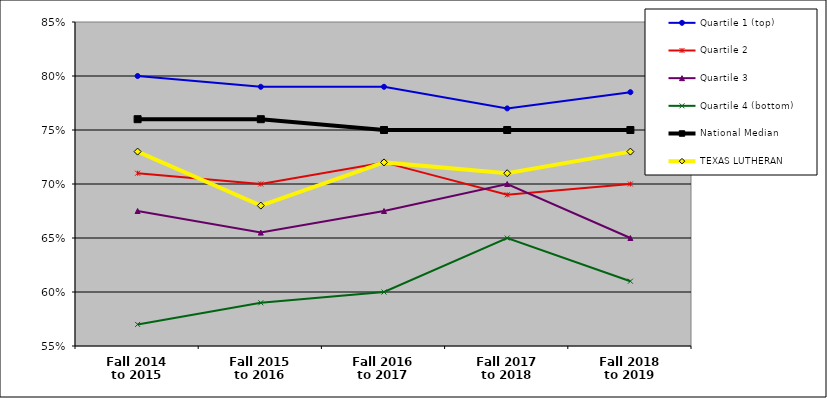
| Category | Quartile 1 (top) | Quartile 2 | Quartile 3 | Quartile 4 (bottom) | National Median | TEXAS LUTHERAN |
|---|---|---|---|---|---|---|
| Fall 2014
to 2015 | 0.8 | 0.71 | 0.675 | 0.57 | 0.76 | 0.73 |
| Fall 2015
to 2016 | 0.79 | 0.7 | 0.655 | 0.59 | 0.76 | 0.68 |
| Fall 2016
to 2017 | 0.79 | 0.72 | 0.675 | 0.6 | 0.75 | 0.72 |
| Fall 2017
to 2018 | 0.77 | 0.69 | 0.7 | 0.65 | 0.75 | 0.71 |
| Fall 2018
to 2019 | 0.785 | 0.7 | 0.65 | 0.61 | 0.75 | 0.73 |